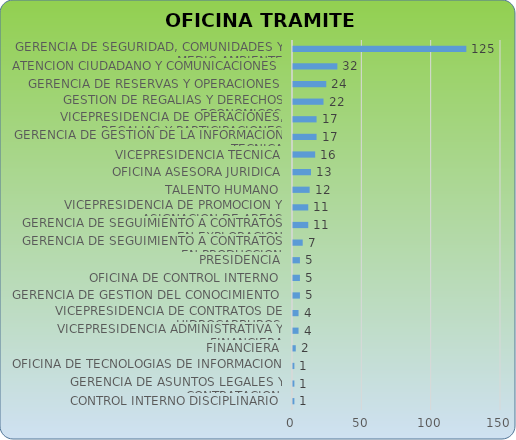
| Category | CANTIDAD |
|---|---|
| CONTROL INTERNO DISCIPLINARIO | 1 |
| GERENCIA DE ASUNTOS LEGALES Y CONTRATACION | 1 |
| OFICINA DE TECNOLOGIAS DE INFORMACION | 1 |
| FINANCIERA | 2 |
| VICEPRESIDENCIA ADMINISTRATIVA Y FINANCIERA | 4 |
| VICEPRESIDENCIA DE CONTRATOS DE HIDROCARBUROS | 4 |
| GERENCIA DE GESTION DEL CONOCIMIENTO | 5 |
| OFICINA DE CONTROL INTERNO | 5 |
| PRESIDENCIA | 5 |
| GERENCIA DE SEGUIMIENTO A CONTRATOS EN PRODUCCION | 7 |
| GERENCIA DE SEGUIMIENTO A CONTRATOS EN EXPLORACION | 11 |
| VICEPRESIDENCIA DE PROMOCION Y ASIGNACION DE AREAS | 11 |
| TALENTO HUMANO | 12 |
| OFICINA ASESORA JURIDICA | 13 |
| VICEPRESIDENCIA TECNICA | 16 |
| GERENCIA DE GESTION DE LA INFORMACION TECNICA | 17 |
| VICEPRESIDENCIA DE OPERACIONES, REGALIAS Y PARTICIPACIONES | 17 |
| GESTION DE REGALIAS Y DERECHOS ECONOMICOS | 22 |
| GERENCIA DE RESERVAS Y OPERACIONES | 24 |
| ATENCION CIUDADANO Y COMUNICACIONES | 32 |
| GERENCIA DE SEGURIDAD, COMUNIDADES Y MEDIO AMBIENTE | 125 |